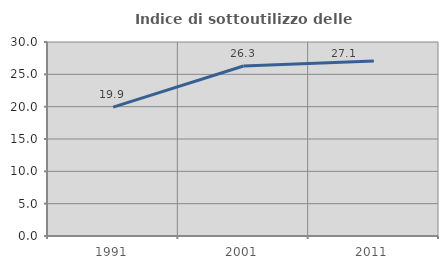
| Category | Indice di sottoutilizzo delle abitazioni  |
|---|---|
| 1991.0 | 19.94 |
| 2001.0 | 26.281 |
| 2011.0 | 27.067 |